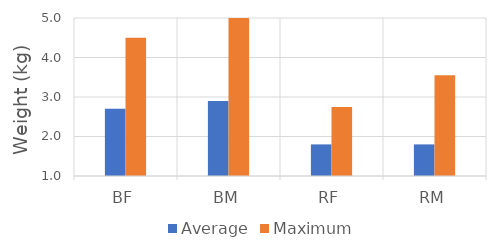
| Category | Average | Maximum |
|---|---|---|
| BF | 2.7 | 4.5 |
| BM | 2.9 | 5.4 |
| RF | 1.8 | 2.75 |
| RM | 1.8 | 3.55 |